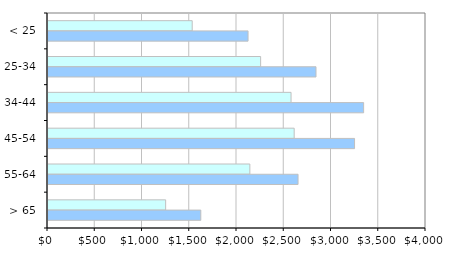
| Category | 2001 | 2010 |
|---|---|---|
| < 25 | 1526 | 2117 |
| 25-34 | 2250 | 2836 |
| 34-44 | 2572 | 3340 |
| 45-54 | 2605 | 3244 |
| 55-64 | 2136 | 2646 |
| > 65 | 1245 | 1617 |